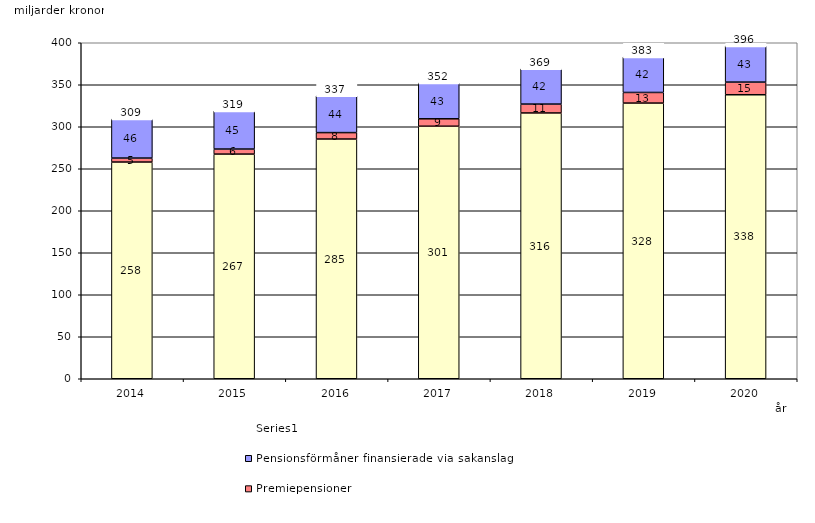
| Category | Inkomstpension och tilläggspension m.m. | Premiepensioner | Pensionsförmåner finansierade via sakanslag | Series 0 |
|---|---|---|---|---|
| 2014.0 | 257.988 | 4.739 | 46.4 | 20 |
| 2015.0 | 267.466 | 6.008 | 45.361 | 20 |
| 2016.0 | 285.397 | 7.636 | 43.822 | 20 |
| 2017.0 | 300.637 | 8.842 | 42.645 | 20 |
| 2018.0 | 316.421 | 10.573 | 41.964 | 20 |
| 2019.0 | 328.198 | 12.63 | 42.238 | 20 |
| 2020.0 | 338.106 | 15.072 | 43.013 | 20 |